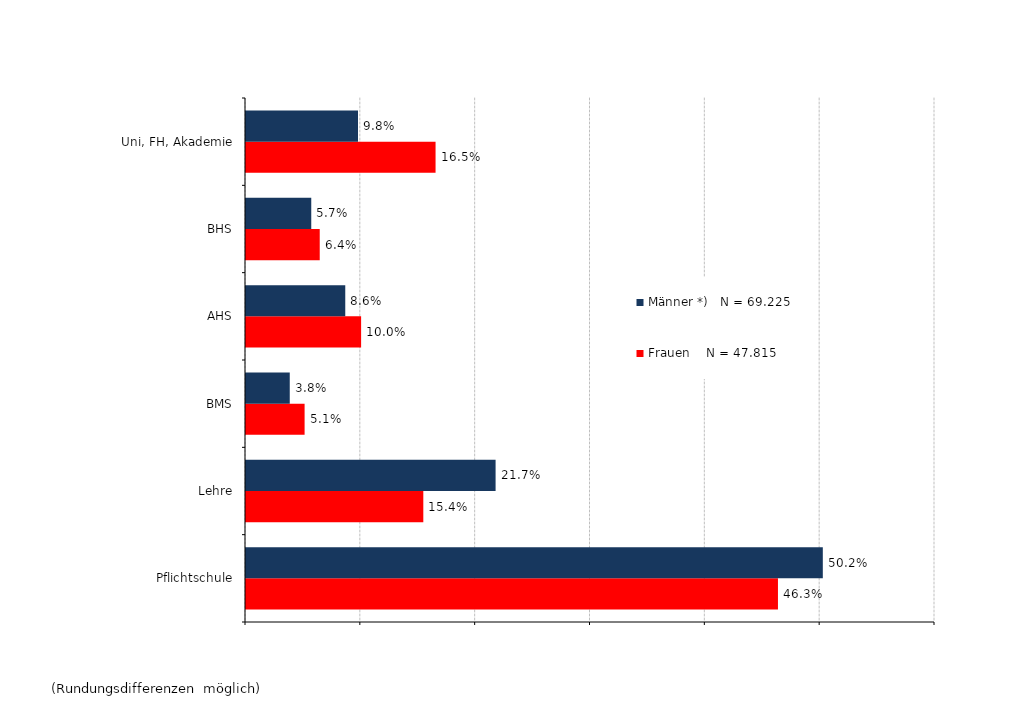
| Category | Frauen    N = 47.815 | Männer *)   N = 69.225 |
|---|---|---|
| Pflichtschule | 0.463 | 0.502 |
| Lehre | 0.154 | 0.217 |
| BMS | 0.051 | 0.038 |
| AHS | 0.1 | 0.086 |
| BHS | 0.064 | 0.057 |
| Uni, FH, Akademie | 0.165 | 0.098 |